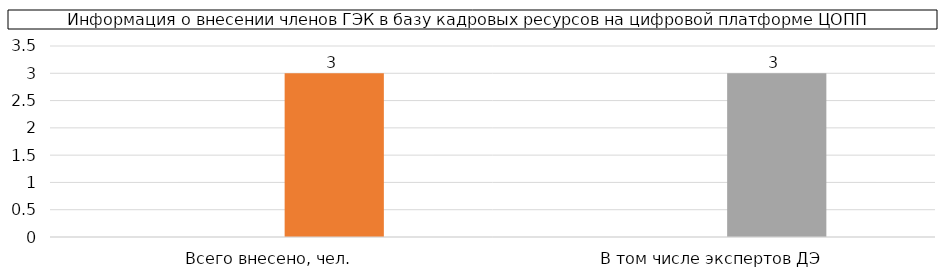
| Category | Series 0 | Series 2 |
|---|---|---|
| Всего внесено, чел. |  | 3 |
| В том числе экспертов ДЭ |  | 3 |